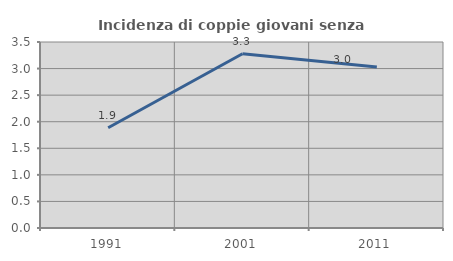
| Category | Incidenza di coppie giovani senza figli |
|---|---|
| 1991.0 | 1.887 |
| 2001.0 | 3.279 |
| 2011.0 | 3.03 |